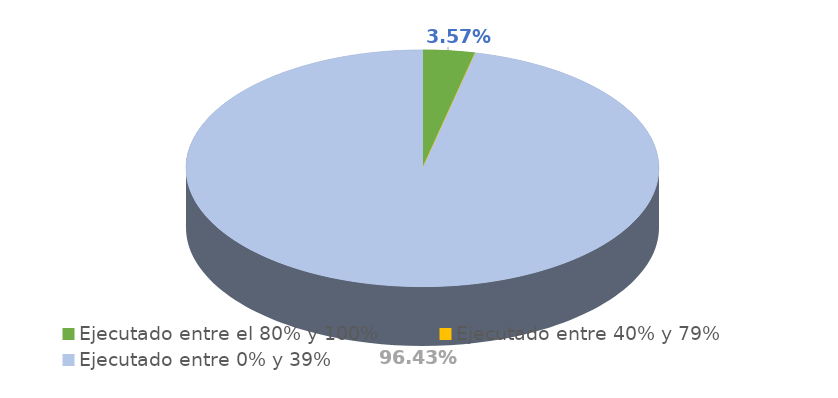
| Category | Series 0 |
|---|---|
| Ejecutado entre el 80% y 100% | 0.036 |
| Ejecutado entre 40% y 79% | 0 |
| Ejecutado entre 0% y 39% | 0.964 |